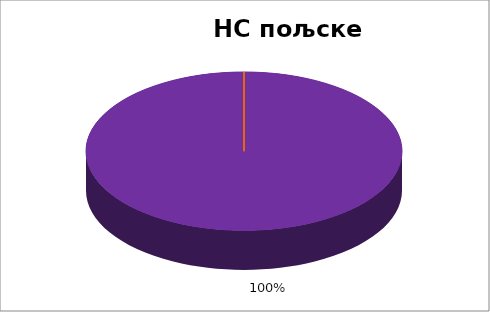
| Category | Series 0 |
|---|---|
| 0 | 0 |
| 1 | 0 |
| 2 | 0 |
| 3 | 0 |
| 4 | 1 |